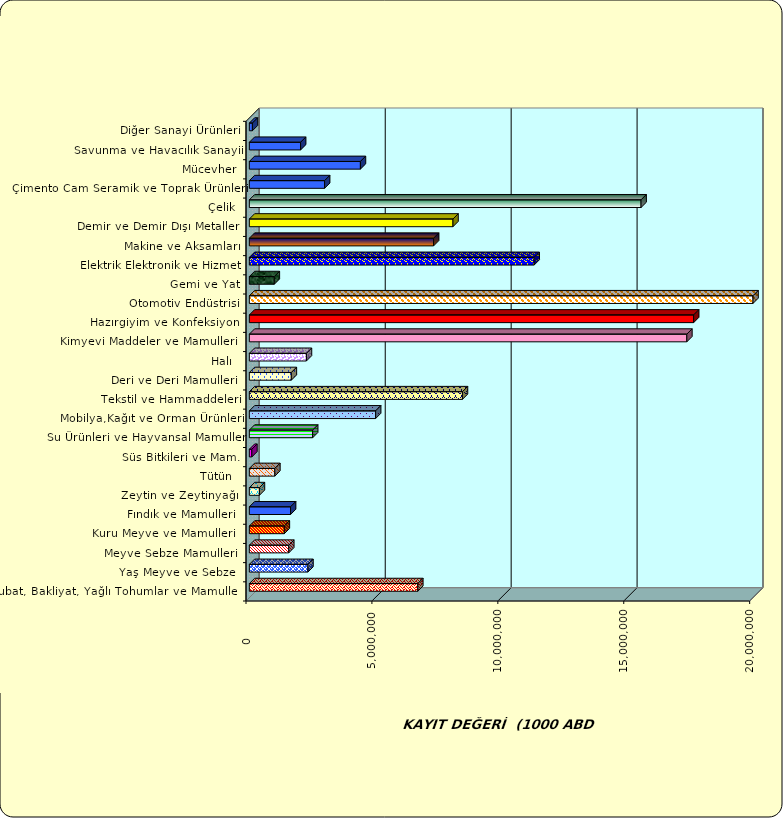
| Category | Series 0 |
|---|---|
|  Hububat, Bakliyat, Yağlı Tohumlar ve Mamulleri  | 6688863.393 |
|  Yaş Meyve ve Sebze   | 2326670.622 |
|  Meyve Sebze Mamulleri  | 1564920.633 |
|  Kuru Meyve ve Mamulleri   | 1388912.331 |
|  Fındık ve Mamulleri  | 1636941.5 |
|  Zeytin ve Zeytinyağı  | 399598.087 |
|  Tütün  | 1011897.074 |
|  Süs Bitkileri ve Mam. | 99299.708 |
|  Su Ürünleri ve Hayvansal Mamuller | 2513892.804 |
|  Mobilya,Kağıt ve Orman Ürünleri | 5014612.984 |
|  Tekstil ve Hammaddeleri | 8461483.367 |
|  Deri ve Deri Mamulleri  | 1667375.157 |
|  Halı  | 2266301.077 |
|  Kimyevi Maddeler ve Mamulleri   | 17372117.197 |
|  Hazırgiyim ve Konfeksiyon  | 17642156.546 |
|  Otomotiv Endüstrisi | 31568468.909 |
|  Gemi ve Yat | 990529.163 |
|  Elektrik Elektronik ve Hizmet | 11309459.296 |
|  Makine ve Aksamları | 7317107.239 |
|  Demir ve Demir Dışı Metaller  | 8086385.539 |
|  Çelik | 15554861.29 |
|  Çimento Cam Seramik ve Toprak Ürünleri | 2987898.806 |
|  Mücevher | 4410439.281 |
|  Savunma ve Havacılık Sanayii | 2035333.656 |
|  Diğer Sanayi Ürünleri | 121660.301 |